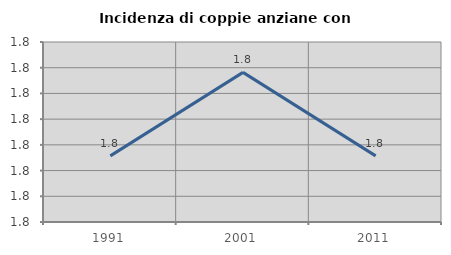
| Category | Incidenza di coppie anziane con figli |
|---|---|
| 1991.0 | 1.786 |
| 2001.0 | 1.818 |
| 2011.0 | 1.786 |